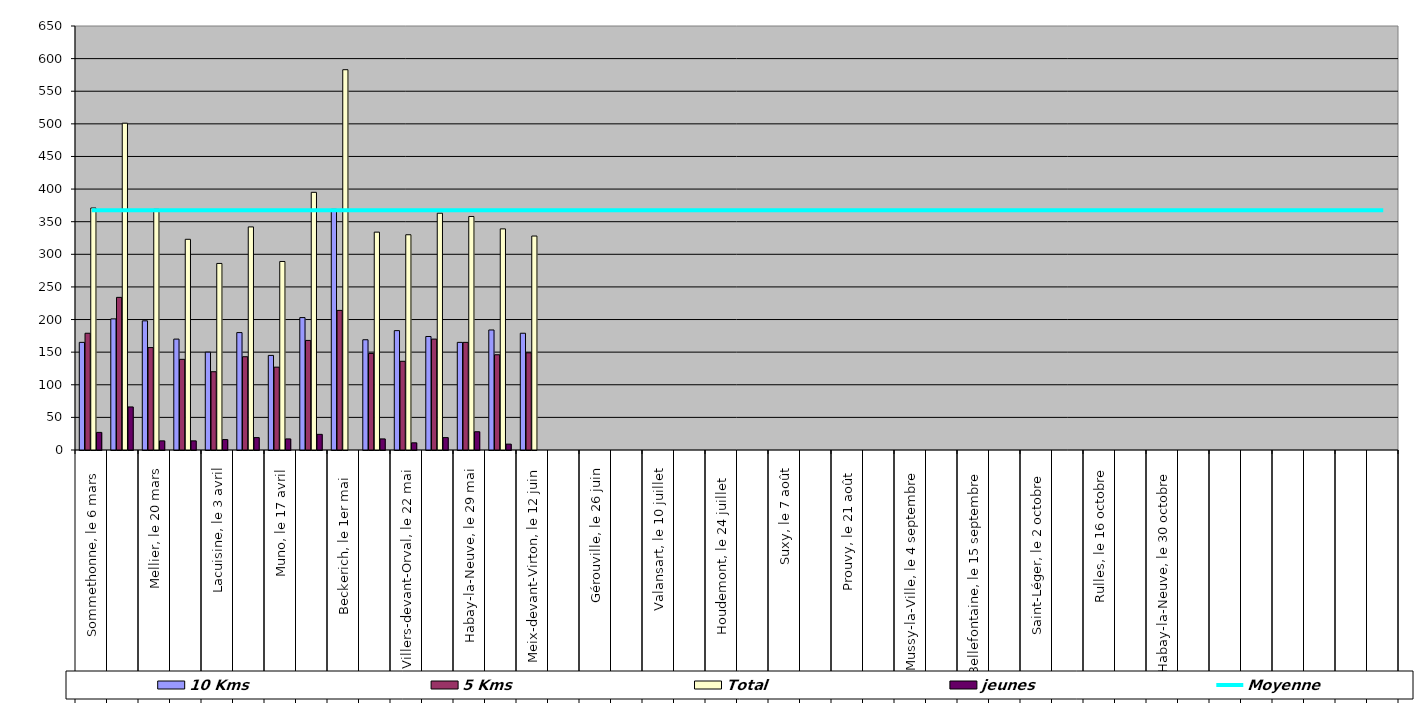
| Category | 10 Kms | 5 Kms | Total | jeunes |
|---|---|---|---|---|
| 0 | 165 | 179 | 371 | 27 |
| 1 | 201 | 234 | 501 | 66 |
| 2 | 198 | 157 | 369 | 14 |
| 3 | 170 | 139 | 323 | 14 |
| 4 | 150 | 120 | 286 | 16 |
| 5 | 180 | 143 | 342 | 19 |
| 6 | 145 | 127 | 289 | 17 |
| 7 | 203 | 168 | 395 | 24 |
| 8 | 369 | 214 | 583 | 0 |
| 9 | 169 | 148 | 334 | 17 |
| 10 | 183 | 136 | 330 | 11 |
| 11 | 174 | 170 | 363 | 19 |
| 12 | 165 | 165 | 358 | 28 |
| 13 | 184 | 146 | 339 | 9 |
| 14 | 179 | 149 | 328 | 0 |
| 15 | 0 | 0 | 0 | 0 |
| 16 | 0 | 0 | 0 | 0 |
| 17 | 0 | 0 | 0 | 0 |
| 18 | 0 | 0 | 0 | 0 |
| 19 | 0 | 0 | 0 | 0 |
| 20 | 0 | 0 | 0 | 0 |
| 21 | 0 | 0 | 0 | 0 |
| 22 | 0 | 0 | 0 | 0 |
| 23 | 0 | 0 | 0 | 0 |
| 24 | 0 | 0 | 0 | 0 |
| 25 | 0 | 0 | 0 | 0 |
| 26 | 0 | 0 | 0 | 0 |
| 27 | 0 | 0 | 0 | 0 |
| 28 | 0 | 0 | 0 | 0 |
| 29 | 0 | 0 | 0 | 0 |
| 30 | 0 | 0 | 0 | 0 |
| 31 | 0 | 0 | 0 | 0 |
| 32 | 0 | 0 | 0 | 0 |
| 33 | 0 | 0 | 0 | 0 |
| 34 | 0 | 0 | 0 | 0 |
| 35 | 0 | 0 | 0 | 0 |
| 36 | 0 | 0 | 0 | 0 |
| 37 | 0 | 0 | 0 | 0 |
| 38 | 0 | 0 | 0 | 0 |
| 39 | 0 | 0 | 0 | 0 |
| 40 | 0 | 0 | 0 | 0 |
| 41 | 0 | 0 | 0 | 0 |